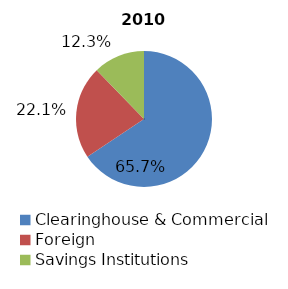
| Category | 2010 |
|---|---|
| Clearinghouse & Commercial | 472 |
| Foreign | 159 |
| Savings Institutions | 88 |